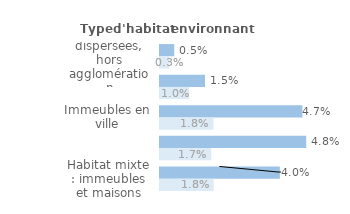
| Category | Series 1 | Series 0 |
|---|---|---|
| Maisons dispersées, hors agglomération | 0.005 | 0.003 |
| Maisons en lotissement, en quartier pavillonnaire | 0.015 | 0.01 |
| Immeubles en ville | 0.047 | 0.018 |
| Immeubles en cité ou grand ensemble | 0.048 | 0.017 |
| Habitat mixte : immeubles et maisons | 0.04 | 0.018 |